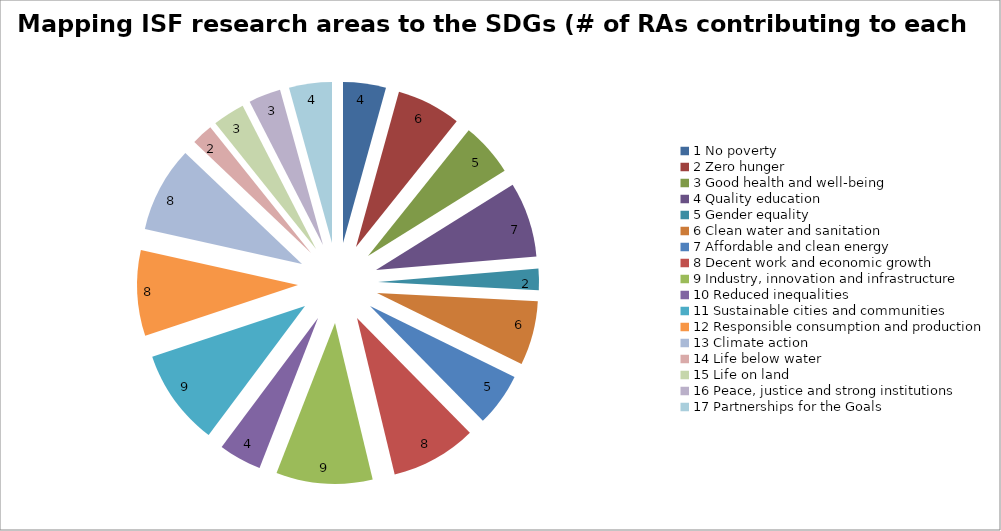
| Category | Series 0 |
|---|---|
| 1 No poverty | 4 |
| 2 Zero hunger | 6 |
| 3 Good health and well-being | 5 |
| 4 Quality education | 7 |
| 5 Gender equality | 2 |
| 6 Clean water and sanitation | 6 |
| 7 Affordable and clean energy | 5 |
| 8 Decent work and economic growth | 8 |
| 9 Industry, innovation and infrastructure | 9 |
| 10 Reduced inequalities | 4 |
| 11 Sustainable cities and communities | 9 |
| 12 Responsible consumption and production | 8 |
| 13 Climate action | 8 |
| 14 Life below water | 2 |
| 15 Life on land | 3 |
| 16 Peace, justice and strong institutions | 3 |
| 17 Partnerships for the Goals | 4 |